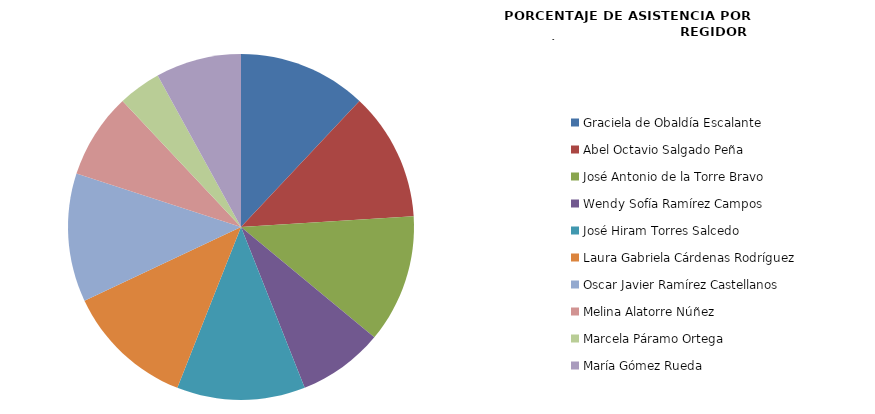
| Category | Series 0 |
|---|---|
| Graciela de Obaldía Escalante | 100 |
| Abel Octavio Salgado Peña | 100 |
| José Antonio de la Torre Bravo | 100 |
| Wendy Sofía Ramírez Campos | 66.667 |
| José Hiram Torres Salcedo | 100 |
| Laura Gabriela Cárdenas Rodríguez | 100 |
| Oscar Javier Ramírez Castellanos | 100 |
| Melina Alatorre Núñez | 66.667 |
| Marcela Páramo Ortega | 33.333 |
| María Gómez Rueda | 66.667 |